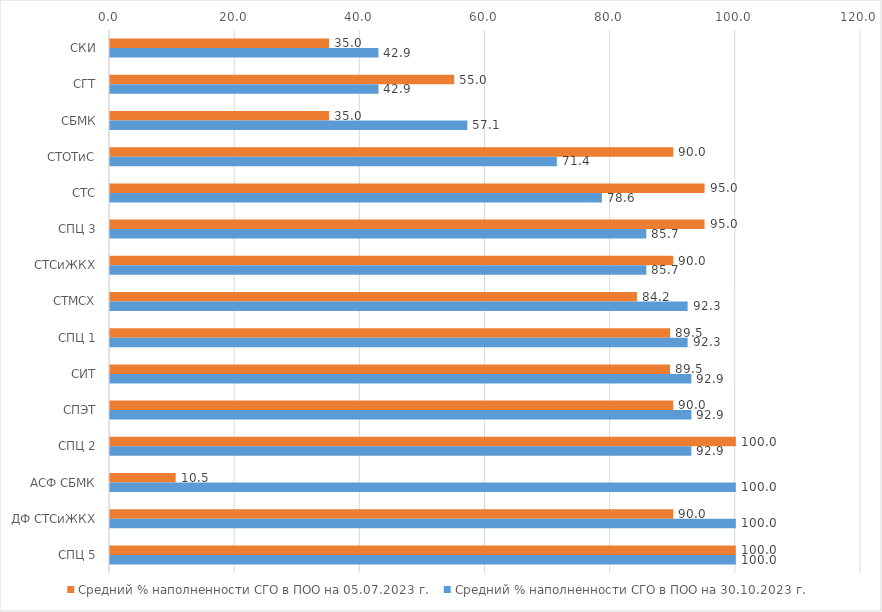
| Category | Средний % наполненности СГО в ПОО на 05.07.2023 г.  | Средний % наполненности СГО в ПОО на 30.10.2023 г.  |
|---|---|---|
| СКИ | 35 | 42.9 |
| СГТ | 55 | 42.9 |
| СБМК | 35 | 57.1 |
| СТОТиС | 90 | 71.4 |
| СТС | 95 | 78.6 |
| СПЦ 3 | 95 | 85.7 |
| СТСиЖКХ | 90 | 85.7 |
| СТМСХ | 84.2 | 92.3 |
| СПЦ 1 | 89.5 | 92.3 |
| СИТ | 89.5 | 92.9 |
| СПЭТ | 90 | 92.9 |
| СПЦ 2 | 100 | 92.9 |
| АСФ СБМК | 10.5 | 100 |
| ДФ СТСиЖКХ | 90 | 100 |
| СПЦ 5 | 100 | 100 |